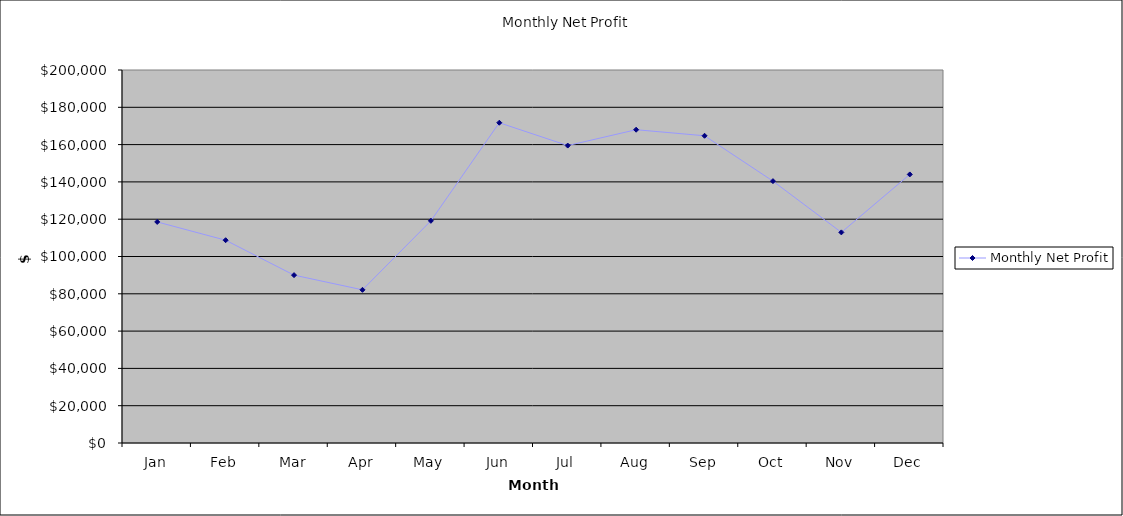
| Category | Monthly Net Profit |
|---|---|
| Jan | 118534.345 |
| Feb | 108734.345 |
| Mar | 90010.879 |
| Apr | 82135.879 |
| May | 119134.345 |
| Jun | 171731.278 |
| Jul | 159481.278 |
| Aug | 167981.278 |
| Sep | 164731.278 |
| Oct | 140407.812 |
| Nov | 112934.345 |
| Dec | 144007.812 |